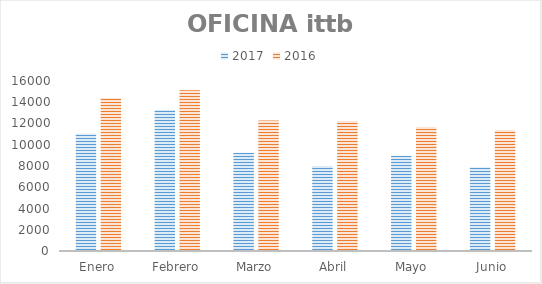
| Category | 2017 | 2016 |
|---|---|---|
| Enero | 11036 | 14400 |
| Febrero | 13280 | 15120 |
| Marzo | 9240 | 12280 |
| Abril | 8000 | 12240 |
| Mayo | 8960 | 11680 |
| Junio | 7880 | 11400 |